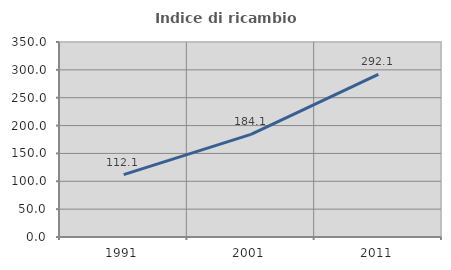
| Category | Indice di ricambio occupazionale  |
|---|---|
| 1991.0 | 112.074 |
| 2001.0 | 184.116 |
| 2011.0 | 292.063 |